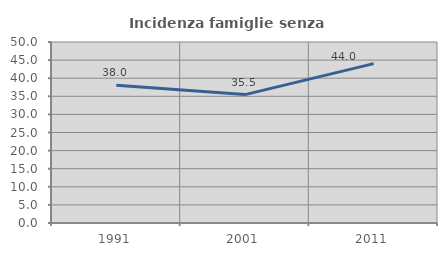
| Category | Incidenza famiglie senza nuclei |
|---|---|
| 1991.0 | 38.028 |
| 2001.0 | 35.468 |
| 2011.0 | 44.037 |